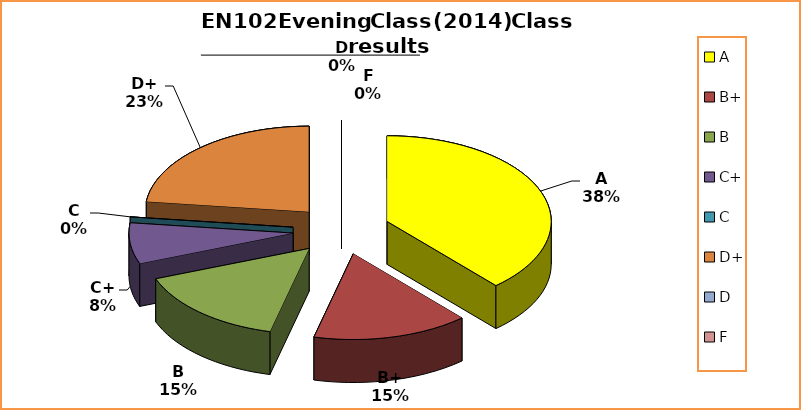
| Category | Series 0 |
|---|---|
| A | 5 |
| B+ | 2 |
| B | 2 |
| C+ | 1 |
| C | 0 |
| D+ | 3 |
| D | 0 |
| F | 0 |